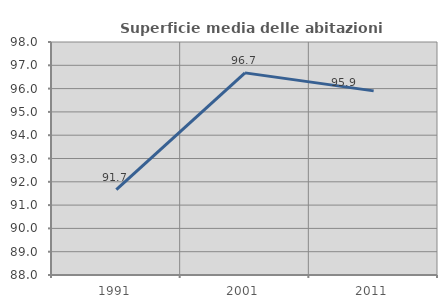
| Category | Superficie media delle abitazioni occupate |
|---|---|
| 1991.0 | 91.663 |
| 2001.0 | 96.675 |
| 2011.0 | 95.902 |